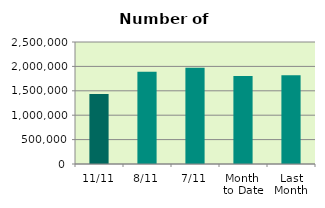
| Category | Series 0 |
|---|---|
| 11/11 | 1433192 |
| 8/11 | 1888168 |
| 7/11 | 1970210 |
| Month 
to Date | 1803116.571 |
| Last
Month | 1817802.609 |